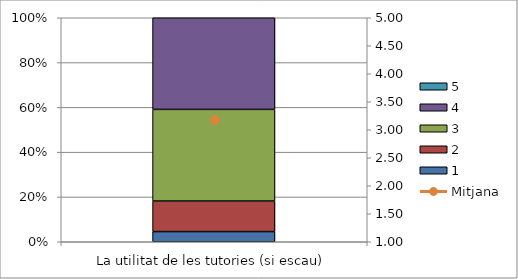
| Category | 1 | 2 | 3 | 4 | 5 |
|---|---|---|---|---|---|
| La utilitat de les tutories (si escau) | 1 | 3 | 9 | 9 | 0 |